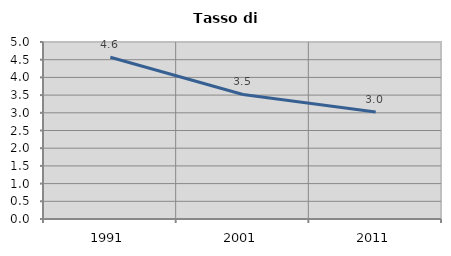
| Category | Tasso di disoccupazione   |
|---|---|
| 1991.0 | 4.569 |
| 2001.0 | 3.518 |
| 2011.0 | 3.02 |